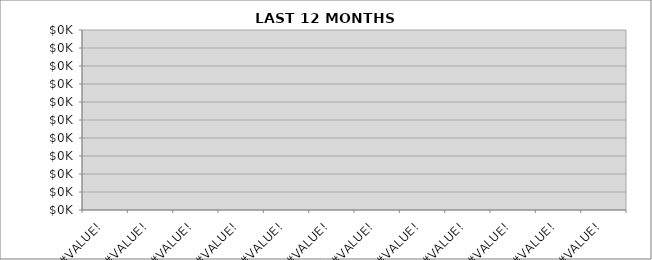
| Category | Monthly Revenue |
|---|---|
| 0.0 | 0 |
| 0.0 | 0 |
| 0.0 | 0 |
| 0.0 | 0 |
| 0.0 | 0 |
| 0.0 | 0 |
| 0.0 | 0 |
| 0.0 | 0 |
| 0.0 | 0 |
| 0.0 | 0 |
| 0.0 | 0 |
| 0.0 | 0 |